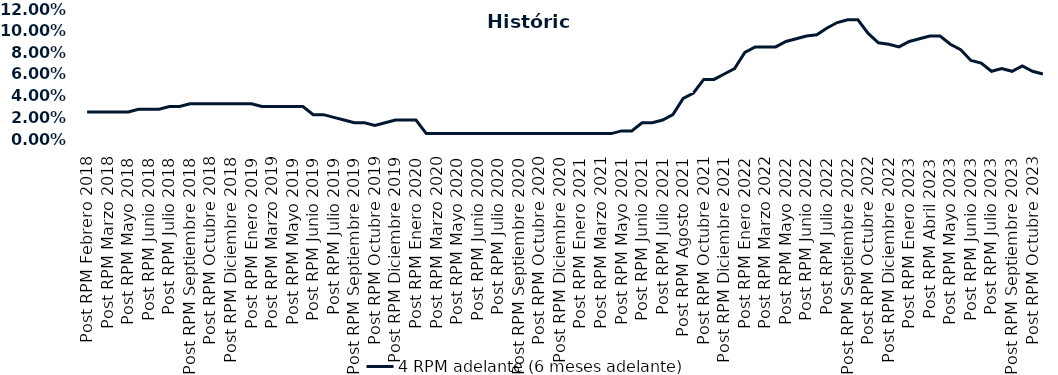
| Category | 4 RPM adelante (6 meses adelante) |
|---|---|
| Post RPM Febrero 2018 | 0.025 |
| Pre RPM Marzo 2018 | 0.025 |
| Post RPM Marzo 2018 | 0.025 |
| Pre RPM Mayo 2018 | 0.025 |
| Post RPM Mayo 2018 | 0.025 |
| Pre RPM Junio 2018 | 0.028 |
| Post RPM Junio 2018 | 0.028 |
| Pre RPM Julio 2018 | 0.028 |
| Post RPM Julio 2018 | 0.03 |
| Pre RPM Septiembre 2018 | 0.03 |
| Post RPM Septiembre 2018 | 0.032 |
| Pre RPM Octubre 2018 | 0.032 |
| Post RPM Octubre 2018 | 0.032 |
| Pre RPM Diciembre 2018 | 0.032 |
| Post RPM Diciembre 2018 | 0.032 |
| Pre RPM Enero 2019 | 0.032 |
| Post RPM Enero 2019 | 0.032 |
| Pre RPM Marzo 2019 | 0.03 |
| Post RPM Marzo 2019 | 0.03 |
| Pre RPM Mayo 2019 | 0.03 |
| Post RPM Mayo 2019 | 0.03 |
| Pre RPM Junio 2019 | 0.03 |
| Post RPM Junio 2019 | 0.022 |
| Pre RPM Julio 2019 | 0.022 |
| Post RPM Julio 2019 | 0.02 |
| Pre RPM Septiembre 2019 | 0.018 |
| Post RPM Septiembre 2019 | 0.015 |
| Pre RPM Octubre 2019 | 0.015 |
| Post RPM Octubre 2019 | 0.012 |
| Pre RPM Diciembre 2019 | 0.015 |
| Post RPM Diciembre 2019 | 0.018 |
| Pre RPM Enero 2020 | 0.018 |
| Post RPM Enero 2020 | 0.018 |
| Pre RPM Marzo 2020 | 0.005 |
| Post RPM Marzo 2020 | 0.005 |
| Pre RPM Mayo 2020 | 0.005 |
| Post RPM Mayo 2020 | 0.005 |
| Pre RPM Junio 2020 | 0.005 |
| Post RPM Junio 2020 | 0.005 |
| Pre RPM Julio 2020 | 0.005 |
| Post RPM Julio 2020 | 0.005 |
| Pre RPM Septiembre 2020 | 0.005 |
| Post RPM Septiembre 2020 | 0.005 |
| Pre RPM Octubre 2020 | 0.005 |
| Post RPM Octubre 2020 | 0.005 |
| Pre RPM Diciembre 2020 | 0.005 |
| Post RPM Diciembre 2020 | 0.005 |
| Pre RPM Enero 2021 | 0.005 |
| Post RPM Enero 2021 | 0.005 |
| Pre RPM Marzo 2021 | 0.005 |
| Post RPM Marzo 2021 | 0.005 |
| Pre RPM Mayo 2021 | 0.005 |
| Post RPM Mayo 2021 | 0.008 |
| Pre RPM Junio 2021 | 0.008 |
| Post RPM Junio 2021 | 0.015 |
| Pre RPM Julio 2021 | 0.015 |
| Post RPM Julio 2021 | 0.018 |
| Pre RPM Agosto 2021 | 0.022 |
| Post RPM Agosto 2021 | 0.038 |
| Pre RPM Octubre 2021 | 0.042 |
| Post RPM Octubre 2021 | 0.055 |
| Pre RPM Diciembre 2021 | 0.055 |
| Post RPM Diciembre 2021 | 0.06 |
| Pre RPM Enero 2022 | 0.065 |
| Post RPM Enero 2022 | 0.08 |
| Pre RPM Marzo 2022 | 0.085 |
| Post RPM Marzo 2022 | 0.085 |
| Pre RPM Mayo 2022 | 0.085 |
| Post RPM Mayo 2022 | 0.09 |
| Pre RPM Junio 2022 | 0.092 |
| Post RPM Junio 2022 | 0.095 |
| Pre RPM Julio 2022 | 0.096 |
| Post RPM Julio 2022 | 0.102 |
| Pre RPM Septiembre 2022 | 0.108 |
| Post RPM Septiembre 2022 | 0.11 |
| Pre RPM Octubre 2022 | 0.11 |
| Post RPM Octubre 2022 | 0.098 |
| Pre RPM Diciembre 2022 | 0.089 |
| Post RPM Diciembre 2022 | 0.088 |
| Pre RPM Enero 2023 | 0.085 |
| Post RPM Enero 2023 | 0.09 |
| Pre RPM Abril 2023 | 0.092 |
| Post RPM Abril 2023 | 0.095 |
| Pre RPM Mayo 2023 | 0.095 |
| Post RPM Mayo 2023 | 0.088 |
| Pre RPM Junio 2023 | 0.082 |
| Post RPM Junio 2023 | 0.072 |
| Pre RPM Julio 2023 | 0.07 |
| Post RPM Julio 2023 | 0.062 |
| Pre RPM Septiembre 2023 | 0.065 |
| Post RPM Septiembre 2023 | 0.062 |
| Pre RPM Octubre 2023 | 0.068 |
| Post RPM Octubre 2023 | 0.062 |
| Pre RPM Diciembre 2023 | 0.06 |